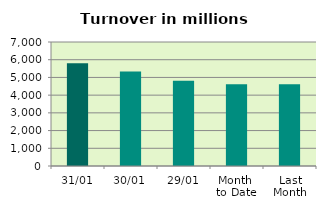
| Category | Series 0 |
|---|---|
| 31/01 | 5804.523 |
| 30/01 | 5330.906 |
| 29/01 | 4808.996 |
| Month 
to Date | 4609.616 |
| Last
Month | 4613.793 |